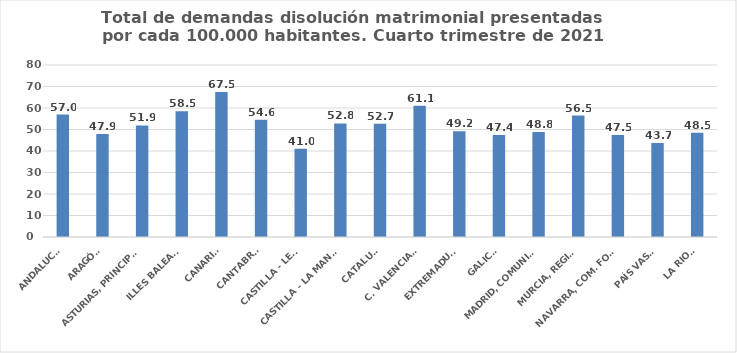
| Category | Series 0 |
|---|---|
| ANDALUCÍA | 56.965 |
| ARAGÓN | 47.879 |
| ASTURIAS, PRINCIPADO | 51.888 |
| ILLES BALEARS | 58.482 |
| CANARIAS | 67.466 |
| CANTABRIA | 54.576 |
| CASTILLA - LEÓN | 41.038 |
| CASTILLA - LA MANCHA | 52.841 |
| CATALUÑA | 52.658 |
| C. VALENCIANA | 61.09 |
| EXTREMADURA | 49.174 |
| GALICIA | 47.41 |
| MADRID, COMUNIDAD | 48.835 |
| MURCIA, REGIÓN | 56.504 |
| NAVARRA, COM. FORAL | 47.465 |
| PAÍS VASCO | 43.677 |
| LA RIOJA | 48.468 |